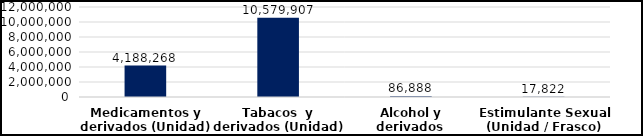
| Category | Series 0 |
|---|---|
| Medicamentos y derivados (Unidad) | 4188268 |
| Tabacos  y derivados (Unidad) | 10579907 |
| Alcohol y derivados  (Botellas) | 86888 |
| Estimulante Sexual (Unidad / Frasco) | 17822 |